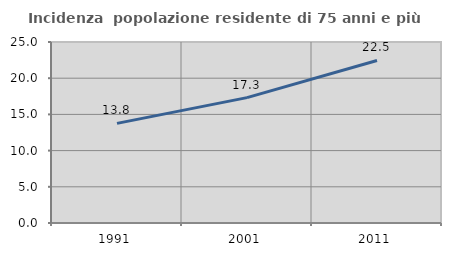
| Category | Incidenza  popolazione residente di 75 anni e più |
|---|---|
| 1991.0 | 13.759 |
| 2001.0 | 17.313 |
| 2011.0 | 22.451 |